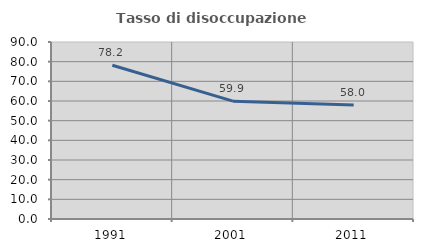
| Category | Tasso di disoccupazione giovanile  |
|---|---|
| 1991.0 | 78.198 |
| 2001.0 | 59.925 |
| 2011.0 | 57.98 |